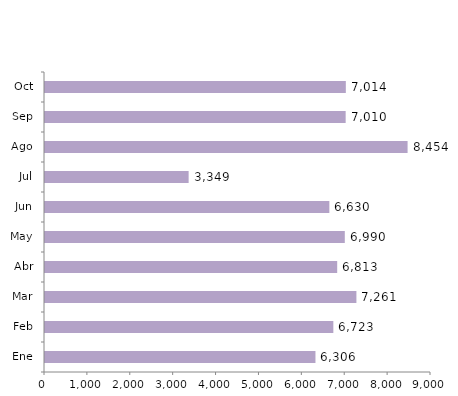
| Category | Series 0 |
|---|---|
| Ene | 6306 |
| Feb | 6723 |
| Mar | 7261 |
| Abr | 6813 |
| May | 6990 |
| Jun | 6630 |
| Jul | 3349 |
| Ago | 8454 |
| Sep | 7010 |
| Oct | 7014 |